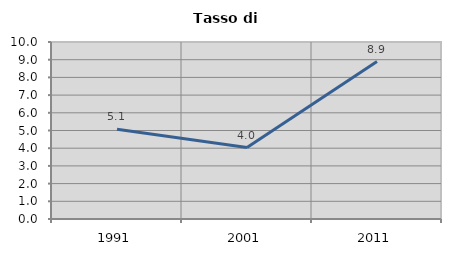
| Category | Tasso di disoccupazione   |
|---|---|
| 1991.0 | 5.069 |
| 2001.0 | 4.037 |
| 2011.0 | 8.895 |